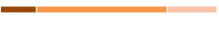
| Category | Series 0 | Series 1 | Series 2 |
|---|---|---|---|
| 0 | 0.167 | 0.603 | 0.23 |